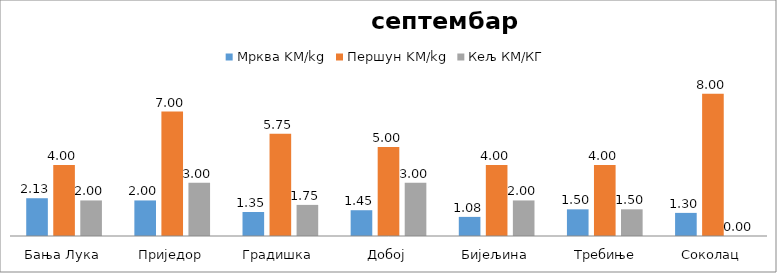
| Category | Мрква KM/kg | Першун KM/kg | Кељ КМ/КГ |
|---|---|---|---|
| Бања Лука | 2.125 | 4 | 2 |
| Приједор | 2 | 7 | 3 |
| Градишка | 1.35 | 5.75 | 1.75 |
| Добој | 1.45 | 5 | 3 |
| Бијељина | 1.075 | 4 | 2 |
|  Требиње | 1.5 | 4 | 1.5 |
| Соколац | 1.3 | 8 | 0 |